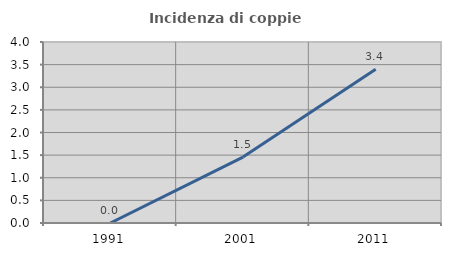
| Category | Incidenza di coppie miste |
|---|---|
| 1991.0 | 0 |
| 2001.0 | 1.458 |
| 2011.0 | 3.395 |